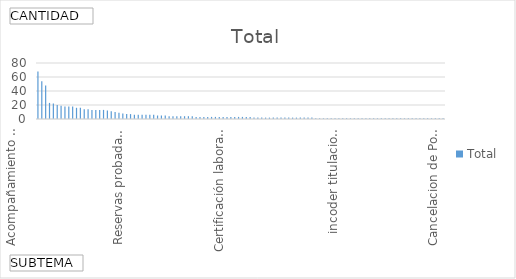
| Category | Total |
|---|---|
| Acompañamiento a comunidad en desarrollo de proyecto (ambiental, social) | 68 |
| Congreso de la República y Senado  | 54 |
| Copias de contratos (E&P, TEAS y Administrativos) | 48 |
| Estado actual de Pozos | 23 |
| Inconformidad por desarrollo irregular de proyecto | 22 |
| Cifras oficiales de producción en el país (producción, precio, demanda, Columnas Estratigráficas | 20 |
| Información del trámite o proceso para pago de regalías | 19 |
| Información de Operadores en Colombia | 18 |
| Intervención por no pago a subcontratistas por parte de Operadoras  | 18 |
| Reliquidación de regalías | 18 |
| Información y aclaración procesos contractuales, términos de referencia, plazos, pólizas | 16 |
| Otros | 16 |
| Actividad Hidrocarburífera en regiones del país | 14 |
| Certificaciones: Regalías, Giros de regalías y embargos de las mismas | 14 |
| Información con fines Académicos (tesis de pregrado y postgrado) | 13 |
| Cartografía zonas Petrolera | 13 |
| Fracking  | 13 |
| Reservas probadas ó estimadas de Hidrocarburos en Colombia | 13 |
| Informes sobres Consultas previas | 12 |
| Impacto y planes de manejo ambiental: Licencias, compromisos E&P normatividad, contaminación | 11 |
| Intervención para que compañía pague daños causados o tomar correctivos | 10 |
| Áreas Asignadas, Áreas libres, reglamentación especial, requisitos y criterios para su asignación | 9 |
| informativo  | 8 |
| Planes de manejo ambiental: Licencias, compromisos E&P, normatividad contaminación | 7 |
| Normatividad sobre exploración, regulación y producción de Hidrocarburos | 7 |
| Intervención para que operador vincule personal | 6 |
| Competencia Ecopetrol  | 6 |
| Asesoría para negociar predio con evidencia de existencia de petróleo | 6 |
| Certificado estado de pozos | 6 |
| FAEP montos girados | 6 |
| Información proyectos de perforación y profundidad | 6 |
| Competencia del Ministerio de Minas y Energía  | 5 |
| informacion institucional  | 5 |
| Estado de contrato de asociación | 5 |
| Comportamiento del mercado de hidrocarburos en Colombia (producción y consumo interno petróleo y gas) | 4 |
| Certificación laboral Colaborador (funcionario o contratista) | 4 |
| intervencion por no pago a contratistas por parte de operador  | 4 |
| Proyección Exploración y Producción de Petróleo en Colombia | 4 |
| Información Geológica de perforaciones | 4 |
| intervencion para que operador vincule personal | 4 |
| Estudios geofísicos y de sísmica | 4 |
| Mapa de Geoquímica | 3 |
| Información y aclaración sobre los TEAs, E&P, Bloques | 3 |
| entes de control  | 3 |
| Geología de Cuencas | 3 |
| Informativa  | 3 |
| Competencia Agencia Nacional de Minería  | 3 |
| Competencia de Medio Ambiente  | 3 |
| Beneficio de población y sus comunidades por actividad petrolera | 3 |
| Planes y proyectos de exploración y expansión de hidrocarburos | 3 |
| Información Institucional: Transformación de Ecopetrol en ANH, misión, visión, funciones y objetivos | 3 |
| Recursos de regalías girados por municipio y departamentos | 3 |
| Rondas Colombia | 3 |
| Certificación de ejecución presupuestal | 3 |
| Competencia Autoridad Nacional de Licencias Ambientales  | 3 |
| Unidad de restitucion de tierras | 3 |
| incoder titulacion de baldios  | 2 |
| Audiencia de rendición de cuentas  | 2 |
| Mecanismos para selección de personal  | 2 |
| Indice de Precios Productor PPI | 2 |
| Proyecciones del país en pozos y sísmica | 2 |
| Documentos de las historias laborales | 2 |
| Manual de Suministro de información técnica y geológica | 2 |
| Empresas con pozos en producción o exploración | 2 |
| areas asignadas, areas libres, reglamentacion especial    | 2 |
| competencia de minminas  | 2 |
| Base de datos de gravimetría y magnetometría de todo el país | 2 |
| Coordenadas de los vértices que limitan bloques | 2 |
| proyecto borrador Offshore | 2 |
| Exploración yacimientos y títulos míneros | 2 |
| Traslado MME | 2 |
| Fiscalización  | 2 |
| Derechos particulares sobre el subsuelo | 1 |
| Auditoria externa | 1 |
| Producción y Fiscalización  | 1 |
| certificacion laboral colaborador  | 1 |
| certificados de retencion año 2015 | 1 |
| Existencia yacimiento de Petróleo | 1 |
| geologia de cuencas  | 1 |
| Traslado MME y ANM | 1 |
| Cancelacion de Polizas de Seguros  | 1 |
| coordenadas de los vertices que limitan bloques  | 1 |
| Relación de Funcionarios que la laboran en la entidad | 1 |
| Intervención para revisión de adjudicación de concurso de Merito   | 1 |
| Incoder Titulación de Baldíos  | 1 |
| Seguros de bienes y muebles de la ANH | 1 |
| informacion con fines academicos | 1 |
| competencia ANM | 1 |
| produccion  | 1 |
| Inversión en los Hidrocarburos  | 1 |
| Promoción y Mercadeo Eventos por realizar organizados ANH | 1 |
| Líneas sísmicas por cuenca | 1 |
| Agradecimientos Felicitaciones  | 1 |
| Información en formato shapefile acerca de las reservas naturales, humedales y comunidades | 1 |
| Impuestos y seguros ANH | 1 |
| Avalúo de las servidumbres petroleras | 1 |
| competencia MinMinas | 1 |
| cuencas sedimentarias | 1 |
| Revisión y análisis comparativo de políticas, marcos legales y procesos de consulta con los pueblos indígenas | 1 |
| Gastos de Publicidad  | 1 |
| informacion de operadores en colombia  | 1 |
| Ofrecimiento de bienes y servicios  | 1 |
| Costos operativos y de proyectos de inversion | 1 |
| Forma 4CR  | 1 |
| certifiacion de ejecucion presupuestal  | 1 |
| informacion de tramite de regalias inversion 1% | 1 |